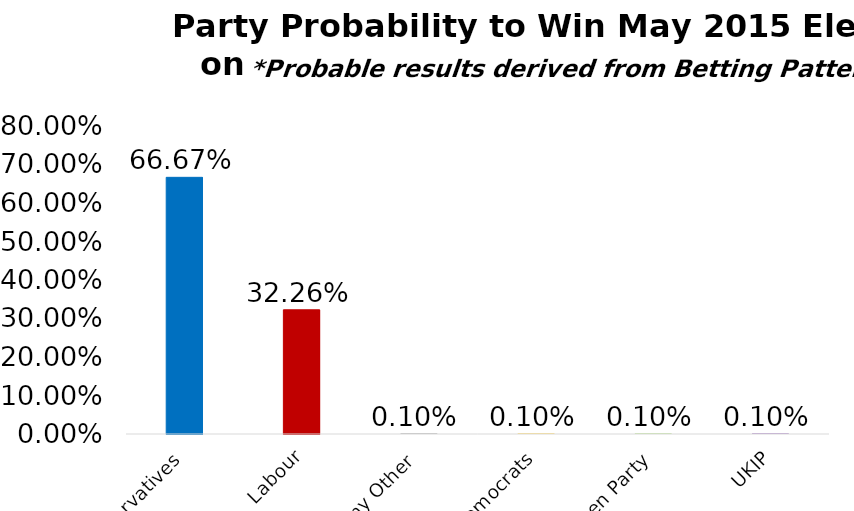
| Category | Results |
|---|---|
| Conservatives | 0.667 |
| Labour | 0.323 |
| Any Other | 0.001 |
| Liberal Democrats | 0.001 |
| Green Party | 0.001 |
| UKIP | 0.001 |